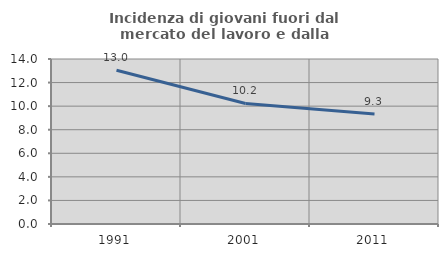
| Category | Incidenza di giovani fuori dal mercato del lavoro e dalla formazione  |
|---|---|
| 1991.0 | 13.043 |
| 2001.0 | 10.227 |
| 2011.0 | 9.333 |